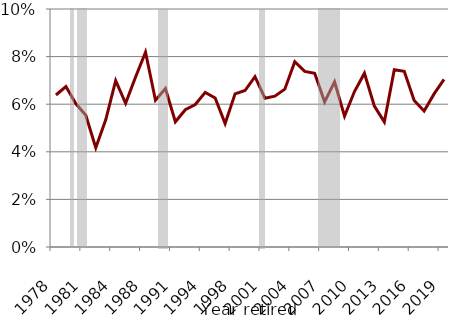
| Category | Retired last year |
|---|---|
| 1978.0 | 0.064 |
| 1979.0 | 0.067 |
| 1980.0 | 0.06 |
| 1981.0 | 0.055 |
| 1982.0 | 0.042 |
| 1983.0 | 0.053 |
| 1984.0 | 0.07 |
| 1986.0 | 0.06 |
| 1987.0 | 0.071 |
| 1988.0 | 0.082 |
| 1989.0 | 0.062 |
| 1990.0 | 0.067 |
| 1991.0 | 0.053 |
| 1992.0 | 0.058 |
| 1993.0 | 0.06 |
| 1994.0 | 0.065 |
| 1996.0 | 0.063 |
| 1997.0 | 0.052 |
| 1998.0 | 0.064 |
| 1999.0 | 0.066 |
| 2000.0 | 0.072 |
| 2001.0 | 0.063 |
| 2002.0 | 0.063 |
| 2003.0 | 0.066 |
| 2004.0 | 0.078 |
| 2005.0 | 0.074 |
| 2006.0 | 0.073 |
| 2007.0 | 0.061 |
| 2008.0 | 0.069 |
| 2009.0 | 0.055 |
| 2010.0 | 0.065 |
| 2011.0 | 0.073 |
| 2012.0 | 0.059 |
| 2013.0 | 0.053 |
| 2014.0 | 0.074 |
| 2015.0 | 0.074 |
| 2016.0 | 0.062 |
| 2017.0 | 0.057 |
| 2018.0 | 0.064 |
| 2019.0 | 0.07 |